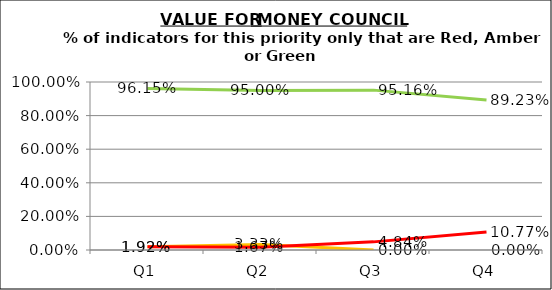
| Category | Green | Amber | Red |
|---|---|---|---|
| Q1 | 0.962 | 0.019 | 0.019 |
| Q2 | 0.95 | 0.033 | 0.017 |
| Q3 | 0.952 | 0 | 0.048 |
| Q4 | 0.892 | 0 | 0.108 |